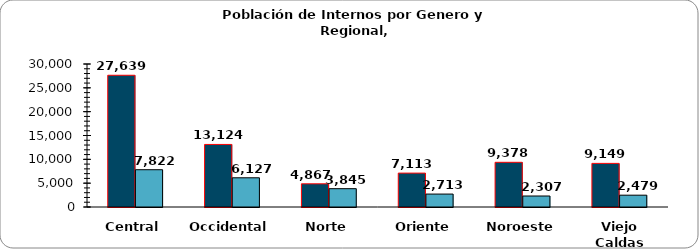
| Category | Condenados | Sindicados |
|---|---|---|
| Central | 27639 | 7822 |
| Occidental | 13124 | 6127 |
| Norte | 4867 | 3845 |
| Oriente | 7113 | 2713 |
| Noroeste | 9378 | 2307 |
| Viejo Caldas | 9149 | 2479 |